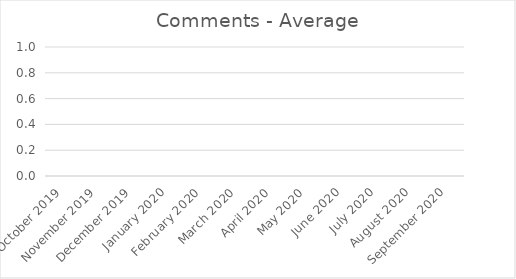
| Category | Average |
|---|---|
| October 2019 | 0 |
| November 2019 | 0 |
| December 2019 | 0 |
| January 2020 | 0 |
| February 2020 | 0 |
| March 2020 | 0 |
| April 2020 | 0 |
| May 2020 | 0 |
| June 2020 | 0 |
| July 2020 | 0 |
| August 2020 | 0 |
| September 2020 | 0 |